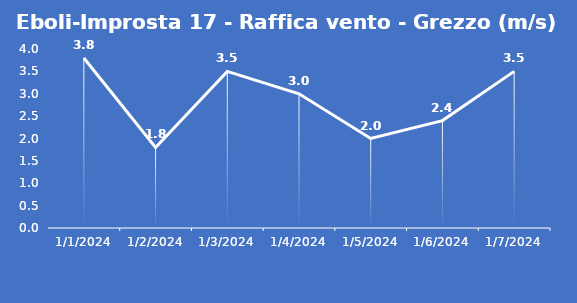
| Category | Eboli-Improsta 17 - Raffica vento - Grezzo (m/s) |
|---|---|
| 1/1/24 | 3.8 |
| 1/2/24 | 1.8 |
| 1/3/24 | 3.5 |
| 1/4/24 | 3 |
| 1/5/24 | 2 |
| 1/6/24 | 2.4 |
| 1/7/24 | 3.5 |